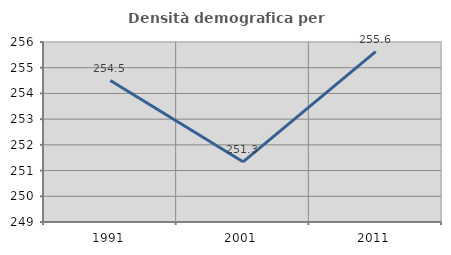
| Category | Densità demografica |
|---|---|
| 1991.0 | 254.5 |
| 2001.0 | 251.341 |
| 2011.0 | 255.626 |